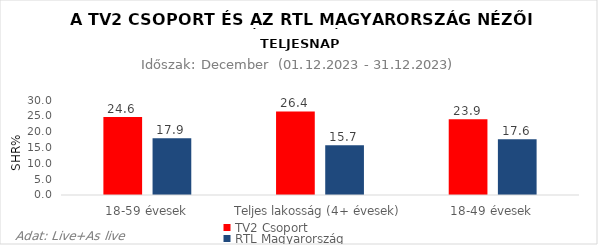
| Category | TV2 Csoport | RTL Magyarország |
|---|---|---|
| 18-59 évesek | 24.6 | 17.9 |
| Teljes lakosság (4+ évesek) | 26.4 | 15.7 |
| 18-49 évesek | 23.9 | 17.6 |